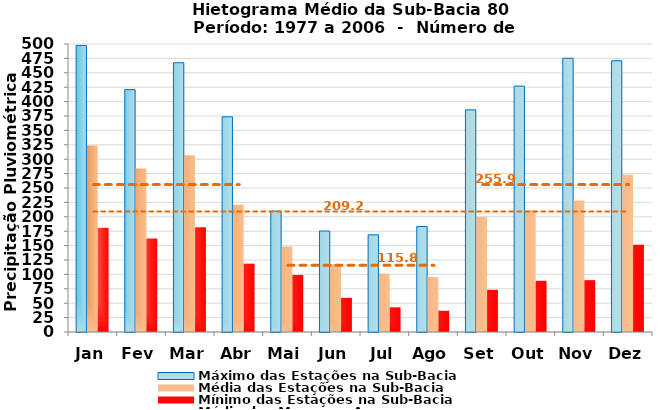
| Category | Máximo das Estações na Sub-Bacia | Média das Estações na Sub-Bacia | Mínimo das Estações na Sub-Bacia |
|---|---|---|---|
| Jan | 497.456 | 323.599 | 181.133 |
| Fev | 420.8 | 283.746 | 162.448 |
| Mar | 467.459 | 306.791 | 181.804 |
| Abr | 373.574 | 220.788 | 118.656 |
| Mai | 209.856 | 148.43 | 99.052 |
| Jun | 175.289 | 117.856 | 59.296 |
| Jul | 168.681 | 101.456 | 42.837 |
| Ago | 183.089 | 95.278 | 36.844 |
| Set | 385.641 | 199.971 | 73.248 |
| Out | 426.874 | 211.049 | 88.904 |
| Nov | 475.256 | 228.328 | 89.97 |
| Dez | 470.933 | 273.037 | 151.319 |